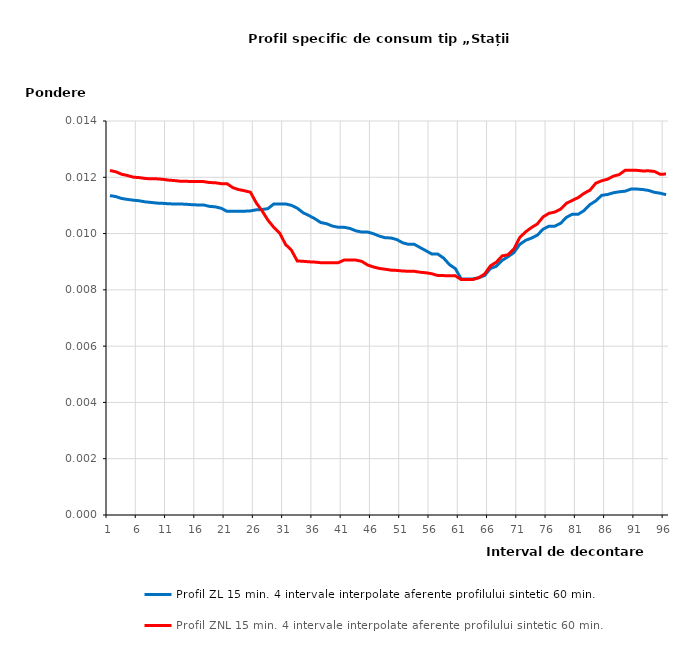
| Category |    Profil ZL 15 min. 4 intervale interpolate aferente profilului sintetic 60 min. |    Profil ZNL 15 min. 4 intervale interpolate aferente profilului sintetic 60 min. |
|---|---|---|
| 1.0 | 0.011 | 0.012 |
| 2.0 | 0.011 | 0.012 |
| 3.0 | 0.011 | 0.012 |
| 4.0 | 0.011 | 0.012 |
| 5.0 | 0.011 | 0.012 |
| 6.0 | 0.011 | 0.012 |
| 7.0 | 0.011 | 0.012 |
| 8.0 | 0.011 | 0.012 |
| 9.0 | 0.011 | 0.012 |
| 10.0 | 0.011 | 0.012 |
| 11.0 | 0.011 | 0.012 |
| 12.0 | 0.011 | 0.012 |
| 13.0 | 0.011 | 0.012 |
| 14.0 | 0.011 | 0.012 |
| 15.0 | 0.011 | 0.012 |
| 16.0 | 0.011 | 0.012 |
| 17.0 | 0.011 | 0.012 |
| 18.0 | 0.011 | 0.012 |
| 19.0 | 0.011 | 0.012 |
| 20.0 | 0.011 | 0.012 |
| 21.0 | 0.011 | 0.012 |
| 22.0 | 0.011 | 0.012 |
| 23.0 | 0.011 | 0.012 |
| 24.0 | 0.011 | 0.012 |
| 25.0 | 0.011 | 0.011 |
| 26.0 | 0.011 | 0.011 |
| 27.0 | 0.011 | 0.011 |
| 28.0 | 0.011 | 0.01 |
| 29.0 | 0.011 | 0.01 |
| 30.0 | 0.011 | 0.01 |
| 31.0 | 0.011 | 0.01 |
| 32.0 | 0.011 | 0.009 |
| 33.0 | 0.011 | 0.009 |
| 34.0 | 0.011 | 0.009 |
| 35.0 | 0.011 | 0.009 |
| 36.0 | 0.011 | 0.009 |
| 37.0 | 0.01 | 0.009 |
| 38.0 | 0.01 | 0.009 |
| 39.0 | 0.01 | 0.009 |
| 40.0 | 0.01 | 0.009 |
| 41.0 | 0.01 | 0.009 |
| 42.0 | 0.01 | 0.009 |
| 43.0 | 0.01 | 0.009 |
| 44.0 | 0.01 | 0.009 |
| 45.0 | 0.01 | 0.009 |
| 46.0 | 0.01 | 0.009 |
| 47.0 | 0.01 | 0.009 |
| 48.0 | 0.01 | 0.009 |
| 49.0 | 0.01 | 0.009 |
| 50.0 | 0.01 | 0.009 |
| 51.0 | 0.01 | 0.009 |
| 52.0 | 0.01 | 0.009 |
| 53.0 | 0.01 | 0.009 |
| 54.0 | 0.01 | 0.009 |
| 55.0 | 0.009 | 0.009 |
| 56.0 | 0.009 | 0.009 |
| 57.0 | 0.009 | 0.009 |
| 58.0 | 0.009 | 0.009 |
| 59.0 | 0.009 | 0.009 |
| 60.0 | 0.009 | 0.009 |
| 61.0 | 0.008 | 0.008 |
| 62.0 | 0.008 | 0.008 |
| 63.0 | 0.008 | 0.008 |
| 64.0 | 0.008 | 0.008 |
| 65.0 | 0.009 | 0.009 |
| 66.0 | 0.009 | 0.009 |
| 67.0 | 0.009 | 0.009 |
| 68.0 | 0.009 | 0.009 |
| 69.0 | 0.009 | 0.009 |
| 70.0 | 0.009 | 0.009 |
| 71.0 | 0.01 | 0.01 |
| 72.0 | 0.01 | 0.01 |
| 73.0 | 0.01 | 0.01 |
| 74.0 | 0.01 | 0.01 |
| 75.0 | 0.01 | 0.011 |
| 76.0 | 0.01 | 0.011 |
| 77.0 | 0.01 | 0.011 |
| 78.0 | 0.01 | 0.011 |
| 79.0 | 0.011 | 0.011 |
| 80.0 | 0.011 | 0.011 |
| 81.0 | 0.011 | 0.011 |
| 82.0 | 0.011 | 0.011 |
| 83.0 | 0.011 | 0.012 |
| 84.0 | 0.011 | 0.012 |
| 85.0 | 0.011 | 0.012 |
| 86.0 | 0.011 | 0.012 |
| 87.0 | 0.011 | 0.012 |
| 88.0 | 0.011 | 0.012 |
| 89.0 | 0.012 | 0.012 |
| 90.0 | 0.012 | 0.012 |
| 91.0 | 0.012 | 0.012 |
| 92.0 | 0.012 | 0.012 |
| 93.0 | 0.012 | 0.012 |
| 94.0 | 0.011 | 0.012 |
| 95.0 | 0.011 | 0.012 |
| 96.0 | 0.011 | 0.012 |